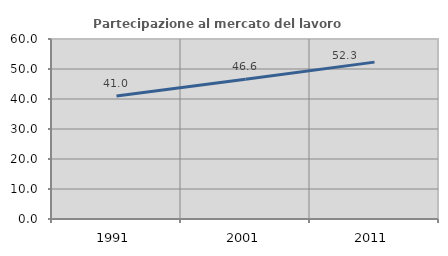
| Category | Partecipazione al mercato del lavoro  femminile |
|---|---|
| 1991.0 | 41.009 |
| 2001.0 | 46.554 |
| 2011.0 | 52.291 |